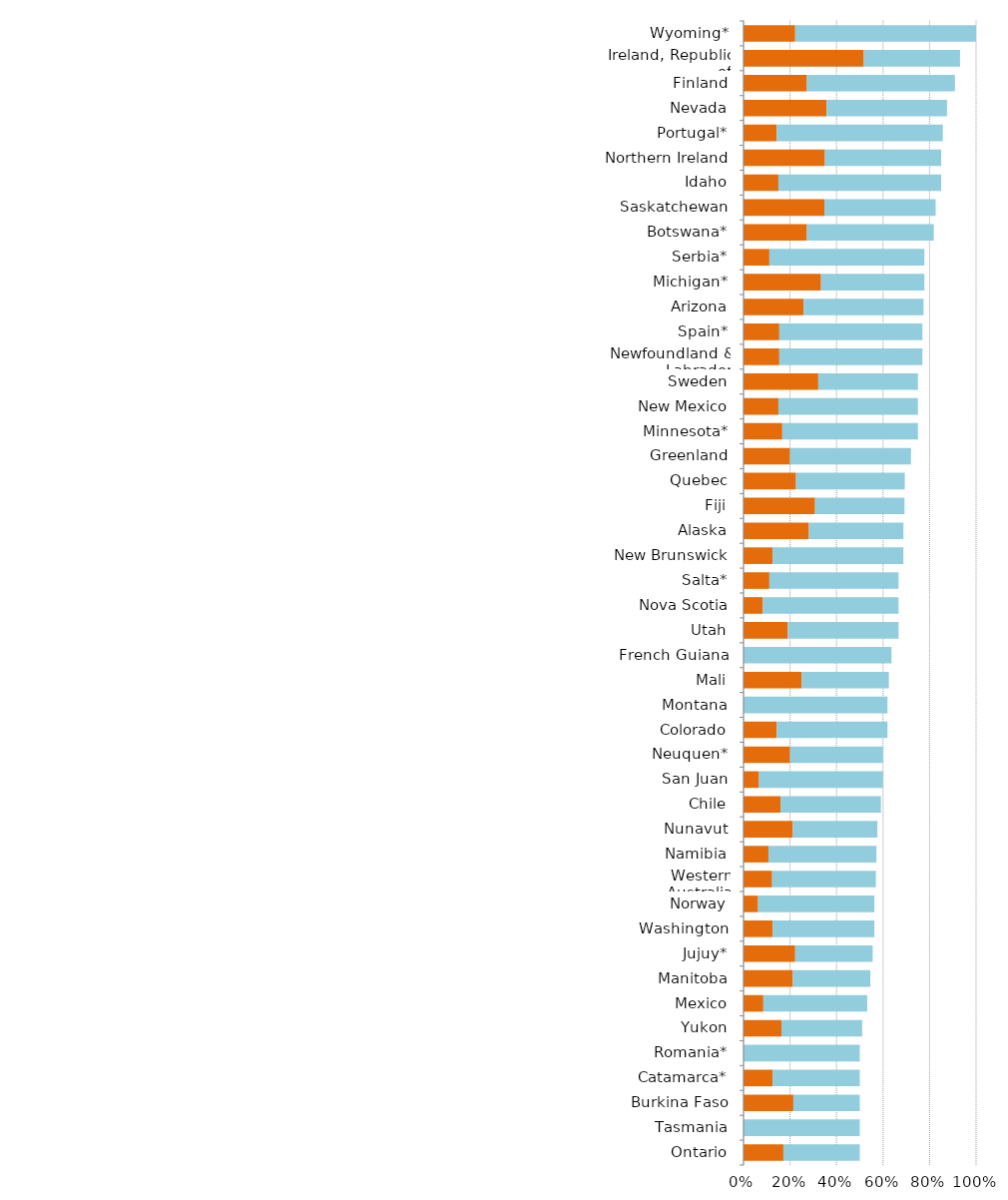
| Category | Series 0 | Series 1 |
|---|---|---|
| Ontario | 0.171 | 0.329 |
| Tasmania | 0 | 0.5 |
| Burkina Faso | 0.214 | 0.286 |
| Catamarca* | 0.125 | 0.375 |
| Romania* | 0 | 0.5 |
| Yukon | 0.163 | 0.347 |
| Mexico | 0.085 | 0.447 |
| Manitoba | 0.212 | 0.333 |
| Jujuy* | 0.222 | 0.333 |
| Washington | 0.125 | 0.438 |
| Norway | 0.062 | 0.5 |
| Western Australia | 0.123 | 0.446 |
| Namibia | 0.107 | 0.464 |
| Nunavut | 0.212 | 0.364 |
| Chile | 0.159 | 0.432 |
| San Juan | 0.067 | 0.533 |
| Neuquen* | 0.2 | 0.4 |
| Colorado | 0.143 | 0.476 |
| Montana | 0 | 0.619 |
| Mali | 0.25 | 0.375 |
| French Guiana | 0 | 0.636 |
| Utah | 0.19 | 0.476 |
| Nova Scotia | 0.083 | 0.583 |
| Salta* | 0.111 | 0.556 |
| New Brunswick | 0.125 | 0.562 |
| Alaska | 0.281 | 0.406 |
| Fiji | 0.308 | 0.385 |
| Quebec | 0.226 | 0.468 |
| Greenland | 0.2 | 0.52 |
| Minnesota* | 0.167 | 0.583 |
| New Mexico | 0.15 | 0.6 |
| Sweden | 0.321 | 0.429 |
| Newfoundland & Labrador | 0.154 | 0.615 |
| Spain* | 0.154 | 0.615 |
| Arizona | 0.258 | 0.516 |
| Michigan* | 0.333 | 0.444 |
| Serbia* | 0.111 | 0.667 |
| Botswana* | 0.273 | 0.545 |
| Saskatchewan | 0.348 | 0.478 |
| Idaho | 0.15 | 0.7 |
| Northern Ireland | 0.35 | 0.5 |
| Portugal* | 0.143 | 0.714 |
| Nevada | 0.357 | 0.518 |
| Finland | 0.273 | 0.636 |
| Ireland, Republic of | 0.517 | 0.414 |
| Wyoming* | 0.222 | 0.778 |